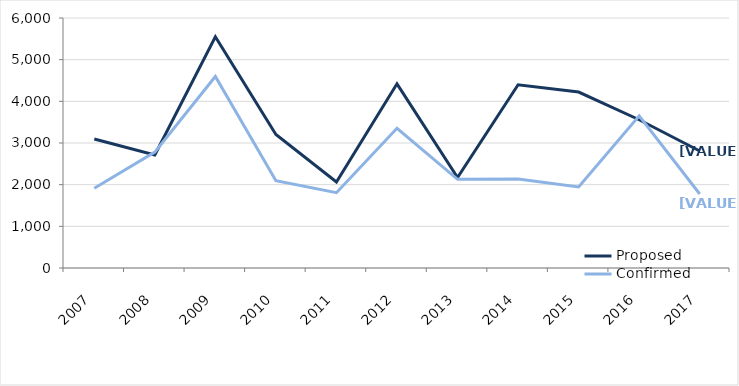
| Category | Proposed | Confirmed |
|---|---|---|
| 2007 | 3096 | 1912 |
| 2008 | 2713 | 2782 |
| 2009 | 5548 | 4596 |
| 2010 | 3205 | 2096 |
| 2011 | 2064 | 1808 |
| 2012 | 4420 | 3353 |
| 2013 | 2172 | 2129 |
| 2014 | 4397 | 2136 |
| 2015 | 4222 | 1946 |
| 2016 | 3558 | 3653 |
| 2017 | 2807 | 1776 |